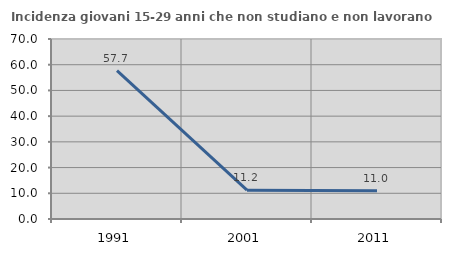
| Category | Incidenza giovani 15-29 anni che non studiano e non lavorano  |
|---|---|
| 1991.0 | 57.672 |
| 2001.0 | 11.207 |
| 2011.0 | 11 |